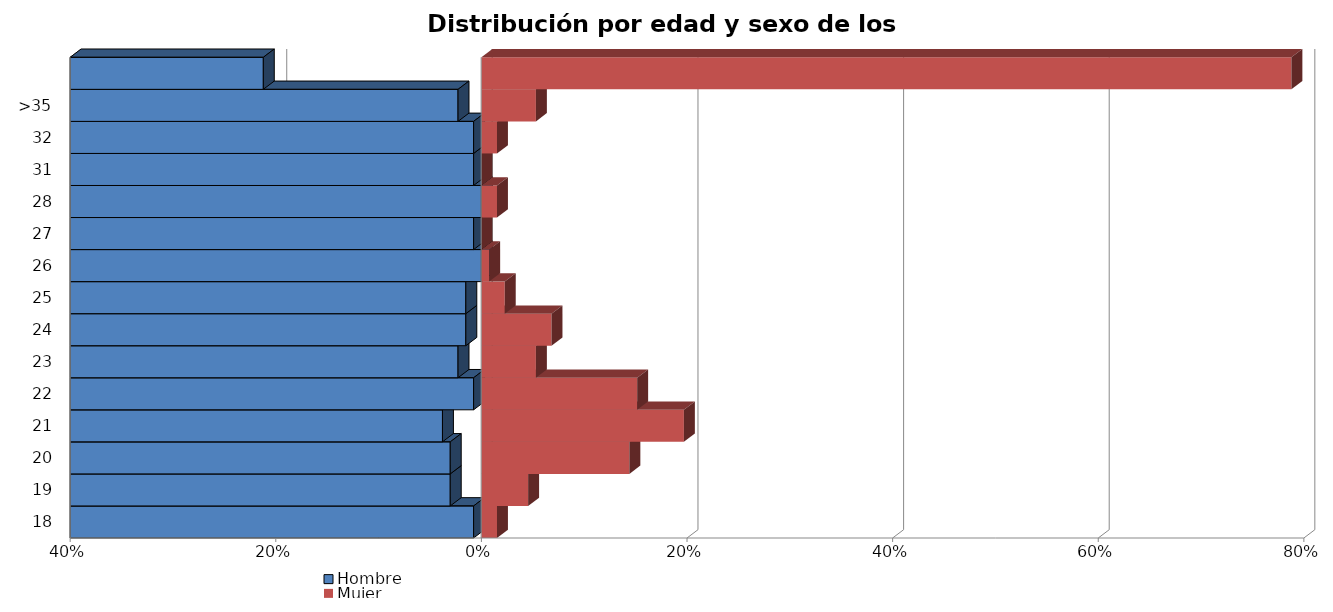
| Category | Hombre | Mujer |
|---|---|---|
| 18 | -0.008 | 0.015 |
| 19 | -0.03 | 0.045 |
| 20 | -0.03 | 0.144 |
| 21 | -0.038 | 0.197 |
| 22 | -0.008 | 0.152 |
| 23 | -0.023 | 0.053 |
| 24 | -0.015 | 0.068 |
| 25 | -0.015 | 0.023 |
| 26 | 0 | 0.008 |
| 27 | -0.008 | 0 |
| 28 | 0 | 0.015 |
| 31 | -0.008 | 0 |
| 32 | -0.008 | 0.015 |
| >35 | -0.023 | 0.053 |